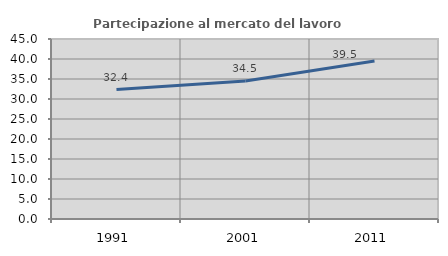
| Category | Partecipazione al mercato del lavoro  femminile |
|---|---|
| 1991.0 | 32.366 |
| 2001.0 | 34.498 |
| 2011.0 | 39.495 |